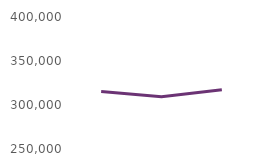
| Category | Users accessing the website |
|---|---|
| May23 | 315230 |
| Jun23 | 309346 |
| Jul23 | 317216 |